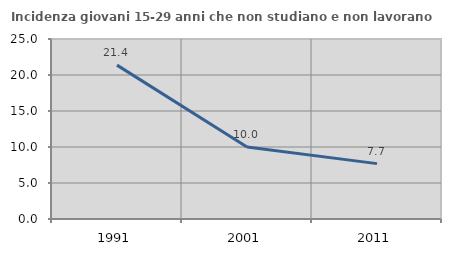
| Category | Incidenza giovani 15-29 anni che non studiano e non lavorano  |
|---|---|
| 1991.0 | 21.371 |
| 2001.0 | 10 |
| 2011.0 | 7.692 |